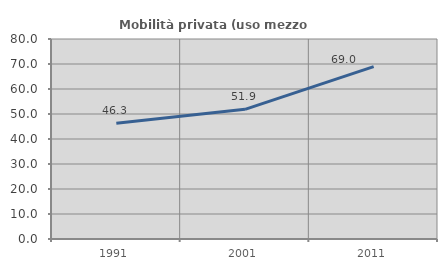
| Category | Mobilità privata (uso mezzo privato) |
|---|---|
| 1991.0 | 46.324 |
| 2001.0 | 51.86 |
| 2011.0 | 68.974 |